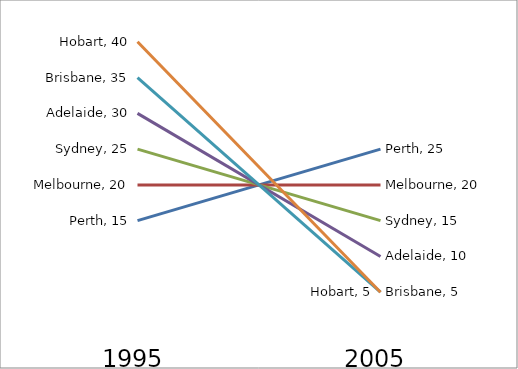
| Category | Perth | Melbourne | Sydney | Adelaide | Brisbane | Hobart |
|---|---|---|---|---|---|---|
| 1995.0 | 15 | 20 | 25 | 30 | 35 | 40 |
| 2005.0 | 25 | 20 | 15 | 10 | 5 | 5 |